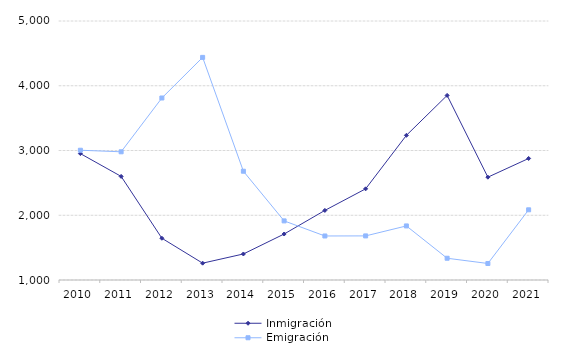
| Category | Inmigración | Emigración |
|---|---|---|
| 2010.0 | 2952 | 3004 |
| 2011.0 | 2600 | 2980 |
| 2012.0 | 1645 | 3811 |
| 2013.0 | 1260 | 4438 |
| 2014.0 | 1402 | 2680 |
| 2015.0 | 1710 | 1913 |
| 2016.0 | 2075 | 1680 |
| 2017.0 | 2408 | 1681 |
| 2018.0 | 3234 | 1835 |
| 2019.0 | 3851 | 1336 |
| 2020.0 | 2588 | 1255 |
| 2021.0 | 2877 | 2084 |